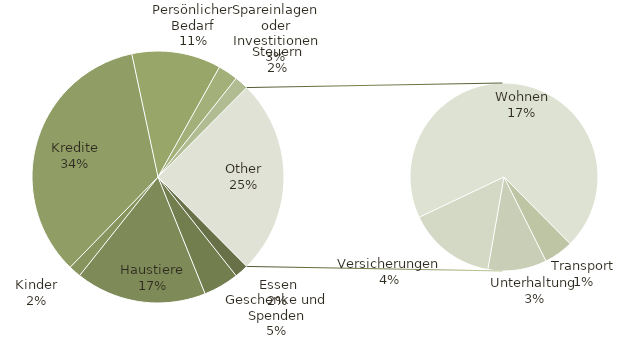
| Category | Ergebnis |
|---|---|
| Essen | 140 |
| Geschenke und Spenden | 358 |
| Haustiere | 1320 |
| Kinder | 125 |
| Kredite | 2702 |
| Persönlicher Bedarf | 900 |
| Spareinlagen oder Investitionen | 200 |
| Steuern | 140 |
| Transport | 100 |
| Unterhaltung | 200 |
| Versicherungen | 300 |
| Wohnen | 1375 |